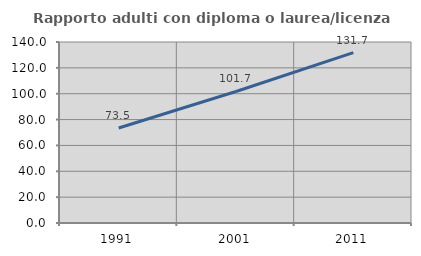
| Category | Rapporto adulti con diploma o laurea/licenza media  |
|---|---|
| 1991.0 | 73.469 |
| 2001.0 | 101.741 |
| 2011.0 | 131.746 |